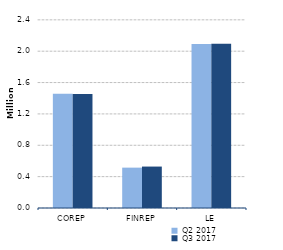
| Category | Q2 2017 | Q3 2017 |
|---|---|---|
| 0 | 1457150 | 1455149 |
| 1/1/00 | 514837 | 528465 |
| 1/2/00 | 2091338 | 2094305 |